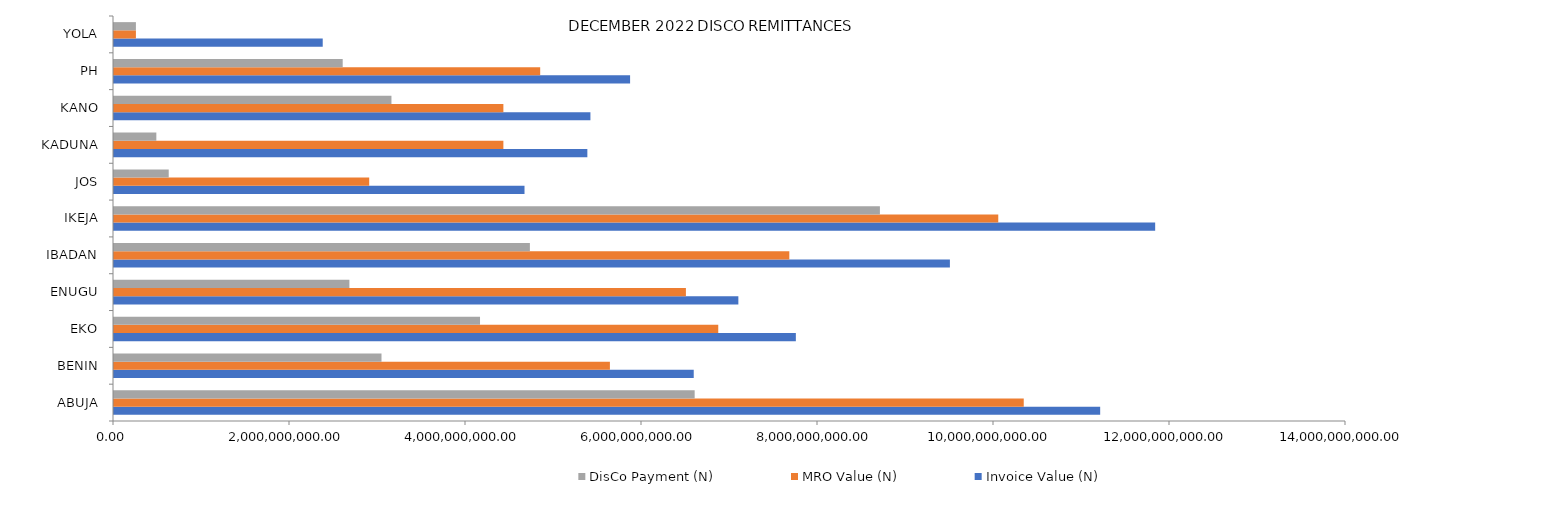
| Category | Invoice Value (N) | MRO Value (N) | DisCo Payment (N) |
|---|---|---|---|
| ABUJA | 11206534904.77 | 10338028449.65 | 6598528915.59 |
| BENIN | 6587864912.65 | 5635259646.281 | 3039765890.88 |
| EKO | 7748317680.1 | 6866559128.105 | 4159268011.37 |
| ENUGU | 7094948225.63 | 6498972574.677 | 2674996461.25 |
| IBADAN | 9498828244.66 | 7674103338.861 | 4726030620.66 |
| IKEJA | 11831481898.48 | 10048477576.379 | 8703502816.36 |
| JOS | 4664891874.21 | 2900163278.196 | 621811791.6 |
| KADUNA | 5379021842.37 | 4424783367.534 | 481121402.16 |
| KANO | 5413893287.38 | 4424774983.776 | 3152807446.69 |
| PH | 5864696393.69 | 4843066281.909 | 2598864996.54 |
| YOLA | 2371860719.3 | 249045375.527 | 249045375.53 |